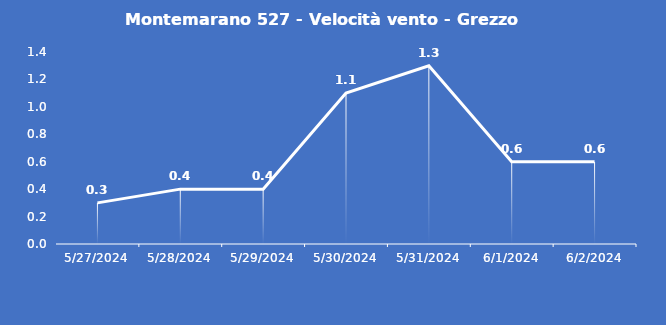
| Category | Montemarano 527 - Velocità vento - Grezzo (m/s) |
|---|---|
| 5/27/24 | 0.3 |
| 5/28/24 | 0.4 |
| 5/29/24 | 0.4 |
| 5/30/24 | 1.1 |
| 5/31/24 | 1.3 |
| 6/1/24 | 0.6 |
| 6/2/24 | 0.6 |